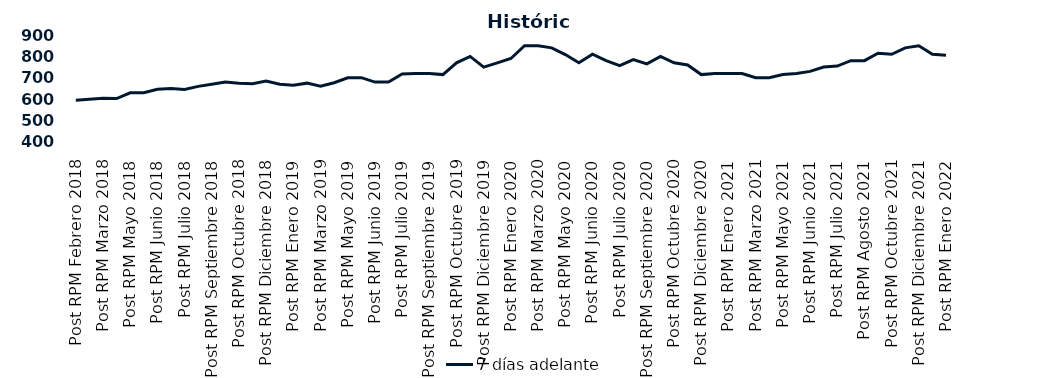
| Category | 7 días adelante  |
|---|---|
| Post RPM Febrero 2018 | 595 |
| Pre RPM Marzo 2018 | 600 |
| Post RPM Marzo 2018 | 605 |
| Pre RPM Mayo 2018 | 603 |
| Post RPM Mayo 2018 | 630 |
| Pre RPM Junio 2018 | 630 |
| Post RPM Junio 2018 | 646.5 |
| Pre RPM Julio 2018 | 650 |
| Post RPM Julio 2018 | 645 |
| Pre RPM Septiembre 2018 | 660 |
| Post RPM Septiembre 2018 | 670 |
| Pre RPM Octubre 2018 | 680 |
| Post RPM Octubre 2018 | 675 |
| Pre RPM Diciembre 2018 | 672.5 |
| Post RPM Diciembre 2018 | 685 |
| Pre RPM Enero 2019 | 670 |
| Post RPM Enero 2019 | 665 |
| Pre RPM Marzo 2019 | 675 |
| Post RPM Marzo 2019 | 661 |
| Pre RPM Mayo 2019 | 677 |
| Post RPM Mayo 2019 | 700 |
| Pre RPM Junio 2019 | 700.5 |
| Post RPM Junio 2019 | 680 |
| Pre RPM Julio 2019 | 680 |
| Post RPM Julio 2019 | 717.5 |
| Pre RPM Septiembre 2019 | 720 |
| Post RPM Septiembre 2019 | 720 |
| Pre RPM Octubre 2019 | 715 |
| Post RPM Octubre 2019 | 770 |
| Pre RPM Diciembre 2019 | 800 |
| Post RPM Diciembre 2019 | 750 |
| Pre RPM Enero 2020 | 770 |
| Post RPM Enero 2020 | 790 |
| Pre RPM Marzo 2020 | 850 |
| Post RPM Marzo 2020 | 850 |
| Pre RPM Mayo 2020 | 840 |
| Post RPM Mayo 2020 | 808.5 |
| Pre RPM Junio 2020 | 770 |
| Post RPM Junio 2020 | 810 |
| Pre RPM Julio 2020 | 780 |
| Post RPM Julio 2020 | 757 |
| Pre RPM Septiembre 2020 | 785 |
| Post RPM Septiembre 2020 | 765 |
| Pre RPM Octubre 2020 | 800 |
| Post RPM Octubre 2020 | 770 |
| Pre RPM Diciembre 2020 | 760 |
| Post RPM Diciembre 2020 | 715 |
| Pre RPM Enero 2021 | 720 |
| Post RPM Enero 2021 | 720 |
| Pre RPM Marzo 2021 | 720 |
| Post RPM Marzo 2021 | 700 |
| Pre RPM Mayo 2021 | 700 |
| Post RPM Mayo 2021 | 715 |
| Pre RPM Junio 2021 | 720 |
| Post RPM Junio 2021 | 730 |
| Pre RPM Julio 2021 | 750 |
| Post RPM Julio 2021 | 755 |
| Pre RPM Agosto 2021 | 780 |
| Post RPM Agosto 2021 | 780 |
| Pre RPM Octubre 2021 | 815 |
| Post RPM Octubre 2021 | 810 |
| Pre RPM Diciembre 2021 | 840 |
| Post RPM Diciembre 2021 | 850 |
| Pre RPM Enero 2022 | 810 |
| Post RPM Enero 2022 | 805 |